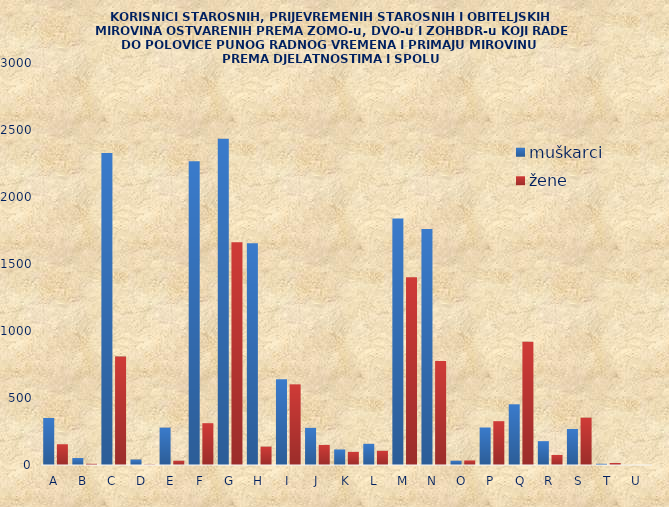
| Category | muškarci | žene |
|---|---|---|
| A | 351 | 155 |
| B | 52 | 9 |
| C | 2329 | 809 |
| D | 41 | 3 |
| E | 279 | 32 |
| F | 2266 | 312 |
| G | 2434 | 1662 |
| H | 1654 | 137 |
| I | 639 | 602 |
| J | 277 | 150 |
| K | 116 | 98 |
| L | 158 | 106 |
| M | 1840 | 1401 |
| N | 1762 | 776 |
| O | 32 | 34 |
| P | 280 | 327 |
| Q | 453 | 919 |
| R | 178 | 75 |
| S | 269 | 353 |
| T | 9 | 15 |
| U | 0 | 0 |